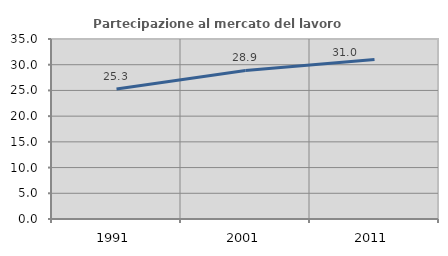
| Category | Partecipazione al mercato del lavoro  femminile |
|---|---|
| 1991.0 | 25.287 |
| 2001.0 | 28.889 |
| 2011.0 | 31.034 |